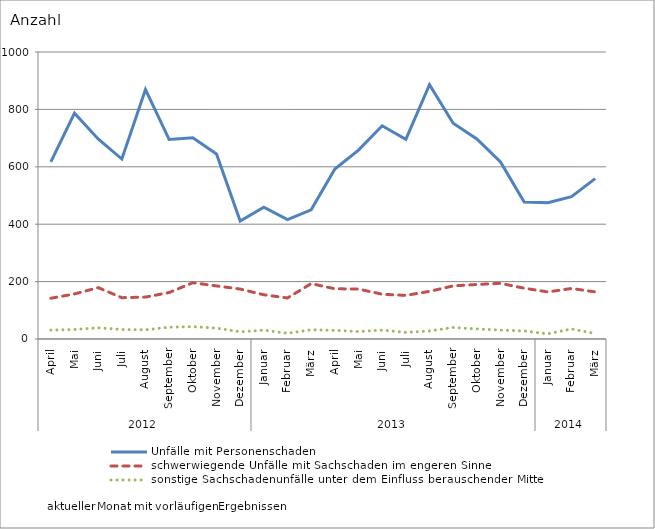
| Category | Unfälle mit Personenschaden | schwerwiegende Unfälle mit Sachschaden im engeren Sinne | sonstige Sachschadenunfälle unter dem Einfluss berauschender Mittel |
|---|---|---|---|
| 0 | 617 | 142 | 31 |
| 1 | 787 | 157 | 33 |
| 2 | 697 | 179 | 39 |
| 3 | 627 | 144 | 33 |
| 4 | 869 | 146 | 32 |
| 5 | 695 | 162 | 41 |
| 6 | 701 | 196 | 43 |
| 7 | 645 | 185 | 38 |
| 8 | 411 | 174 | 25 |
| 9 | 459 | 154 | 31 |
| 10 | 416 | 143 | 20 |
| 11 | 450 | 193 | 32 |
| 12 | 592 | 175 | 30 |
| 13 | 658 | 174 | 26 |
| 14 | 743 | 156 | 31 |
| 15 | 696 | 152 | 23 |
| 16 | 886 | 166 | 28 |
| 17 | 752 | 185 | 40 |
| 18 | 697 | 190 | 35 |
| 19 | 617 | 194 | 31 |
| 20 | 477 | 177 | 28 |
| 21 | 475 | 164 | 18 |
| 22 | 496 | 176 | 35 |
| 23 | 559 | 164 | 19 |